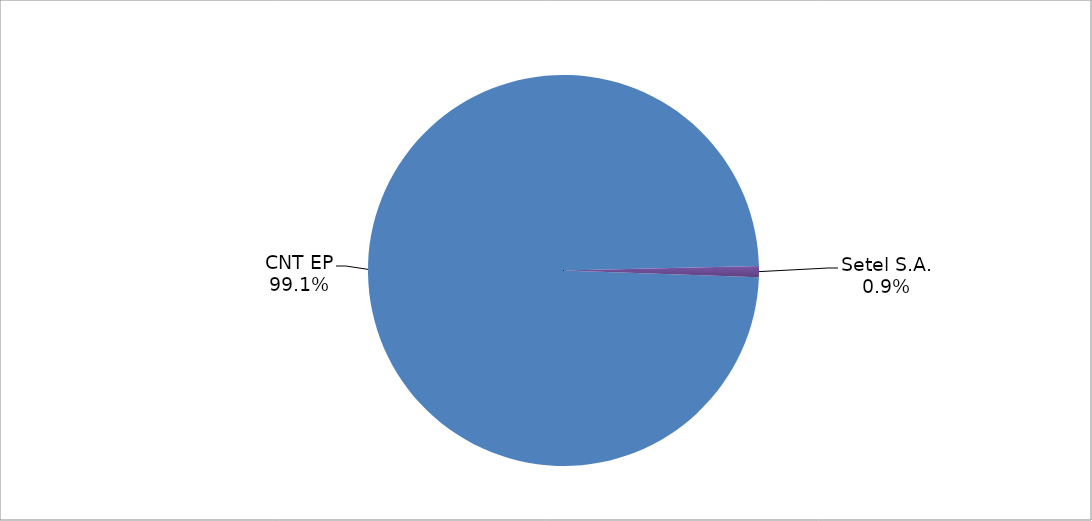
| Category | Series 0 |
|---|---|
| CNT EP | 321 |
| Setel S.A. | 3 |